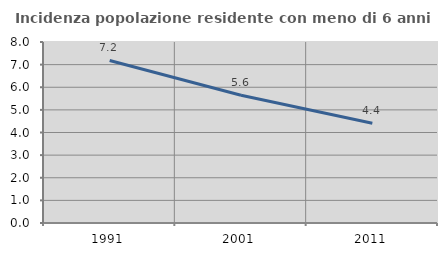
| Category | Incidenza popolazione residente con meno di 6 anni |
|---|---|
| 1991.0 | 7.183 |
| 2001.0 | 5.65 |
| 2011.0 | 4.413 |